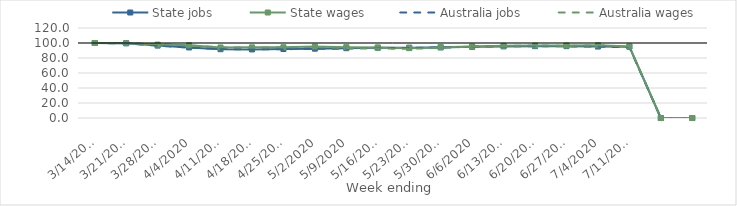
| Category | State jobs | State wages | Australia jobs | Australia wages |
|---|---|---|---|---|
| 14/03/2020 | 100 | 100 | 100 | 100 |
| 21/03/2020 | 99.672 | 99.669 | 99.345 | 99.743 |
| 28/03/2020 | 96.545 | 97.835 | 96.491 | 98.481 |
| 04/04/2020 | 94.056 | 96.907 | 93.819 | 96.778 |
| 11/04/2020 | 91.769 | 94.047 | 91.996 | 94.184 |
| 18/04/2020 | 91.434 | 94.201 | 91.451 | 94.032 |
| 25/04/2020 | 91.999 | 94.383 | 91.738 | 94.241 |
| 02/05/2020 | 92.449 | 95.211 | 92.109 | 94.689 |
| 09/05/2020 | 93.086 | 94.467 | 92.629 | 93.316 |
| 16/05/2020 | 93.697 | 94.041 | 93.158 | 92.67 |
| 23/05/2020 | 93.832 | 93.11 | 93.449 | 92.26 |
| 30/05/2020 | 94.113 | 94.47 | 94.006 | 93.552 |
| 06/06/2020 | 94.889 | 95.323 | 94.942 | 95.15 |
| 13/06/2020 | 95.483 | 96.203 | 95.443 | 95.811 |
| 20/06/2020 | 95.8 | 96.539 | 95.785 | 96.851 |
| 27/06/2020 | 95.804 | 96.683 | 95.571 | 95.974 |
| 04/07/2020 | 95.258 | 96.874 | 95.033 | 96.971 |
| 11/07/2020 | 95.044 | 95.252 | 94.423 | 95.167 |